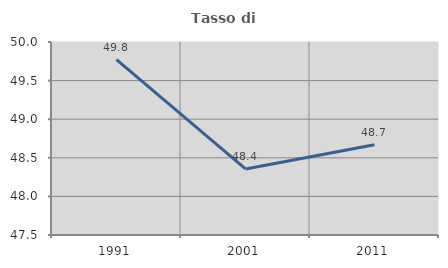
| Category | Tasso di occupazione   |
|---|---|
| 1991.0 | 49.772 |
| 2001.0 | 48.355 |
| 2011.0 | 48.67 |